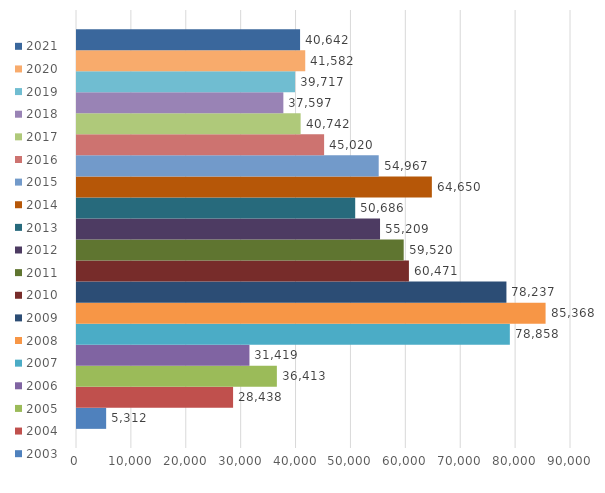
| Category | 2003 | 2004 | 2005 | 2006 | 2007 | 2008 | 2009 | 2010 | 2011 | 2012 | 2013 | 2014 | 2015 | 2016 | 2017 | 2018 | 2019 | 2020 | 2021 |
|---|---|---|---|---|---|---|---|---|---|---|---|---|---|---|---|---|---|---|---|
| 0 | 5312 | 28438 | 36413 | 31419 | 78858 | 85368 | 78237 | 60471 | 59520 | 55209 | 50686 | 64650 | 54967 | 45020 | 40742 | 37597 | 39717 | 41582 | 40642 |